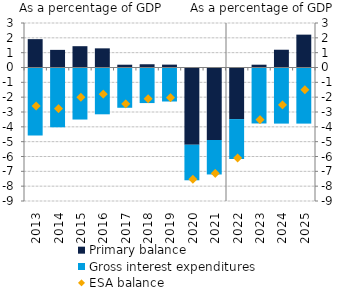
| Category | Primary balance | Gross interest expenditures |
|---|---|---|
| 2013.0 | 1.912 | -4.51 |
| 2014.0 | 1.188 | -3.963 |
| 2015.0 | 1.436 | -3.44 |
| 2016.0 | 1.291 | -3.088 |
| 2017.0 | 0.188 | -2.647 |
| 2018.0 | 0.218 | -2.331 |
| 2019.0 | 0.194 | -2.225 |
| 2020.0 | -5.208 | -2.328 |
| 2021.0 | -4.888 | -2.255 |
| 2022.0 | -3.48 | -2.62 |
| 2023.0 | 0.189 | -3.707 |
| 2024.0 | 1.198 | -3.715 |
| 2025.0 | 2.215 | -3.715 |